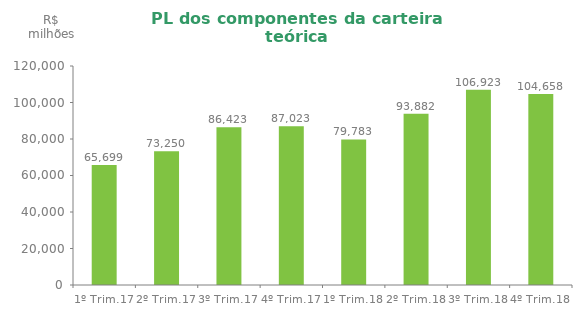
| Category | Series 0 |
|---|---|
| 1º Trim.17 | 65699.44 |
| 2º Trim.17 | 73250.496 |
| 3º Trim.17 | 86422.542 |
| 4º Trim.17 | 87022.625 |
| 1º Trim.18 | 79783.188 |
| 2º Trim.18 | 93882.016 |
| 3º Trim.18 | 106923.21 |
| 4º Trim.18 | 104658.138 |